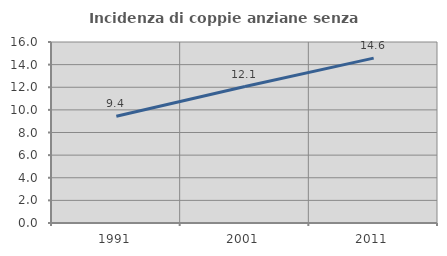
| Category | Incidenza di coppie anziane senza figli  |
|---|---|
| 1991.0 | 9.44 |
| 2001.0 | 12.064 |
| 2011.0 | 14.573 |